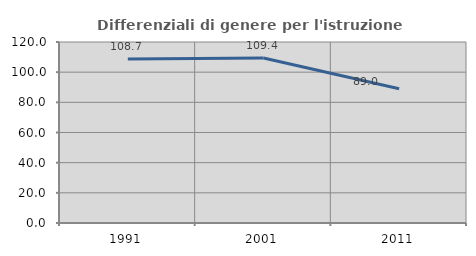
| Category | Differenziali di genere per l'istruzione superiore |
|---|---|
| 1991.0 | 108.69 |
| 2001.0 | 109.391 |
| 2011.0 | 88.997 |